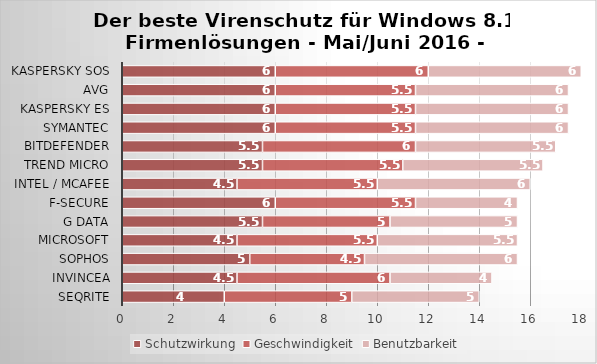
| Category | Schutzwirkung | Geschwindigkeit | Benutzbarkeit |
|---|---|---|---|
| Seqrite | 4 | 5 | 5 |
| Invincea | 4.5 | 6 | 4 |
| Sophos | 5 | 4.5 | 6 |
| Microsoft | 4.5 | 5.5 | 5.5 |
| G Data | 5.5 | 5 | 5 |
| F-Secure | 6 | 5.5 | 4 |
| Intel / McAfee | 4.5 | 5.5 | 6 |
| Trend Micro | 5.5 | 5.5 | 5.5 |
| Bitdefender | 5.5 | 6 | 5.5 |
| Symantec | 6 | 5.5 | 6 |
| Kaspersky ES | 6 | 5.5 | 6 |
| AVG | 6 | 5.5 | 6 |
| Kaspersky SOS | 6 | 6 | 6 |